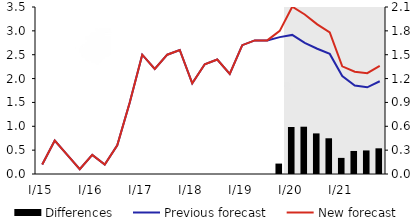
| Category | Differences |
|---|---|
| 0 | 0 |
| 1 | 0 |
| 2 | 0 |
| 3 | 0 |
| 4 | 0 |
| 5 | 0 |
| 6 | 0 |
| 7 | 0 |
| 8 | 0 |
| 9 | 0 |
| 10 | 0 |
| 11 | 0 |
| 12 | 0 |
| 13 | 0 |
| 14 | 0 |
| 15 | 0 |
| 16 | 0 |
| 17 | 0 |
| 18 | 0 |
| 19 | 0.131 |
| 20 | 0.591 |
| 21 | 0.595 |
| 22 | 0.511 |
| 23 | 0.449 |
| 24 | 0.203 |
| 25 | 0.29 |
| 26 | 0.296 |
| 27 | 0.323 |